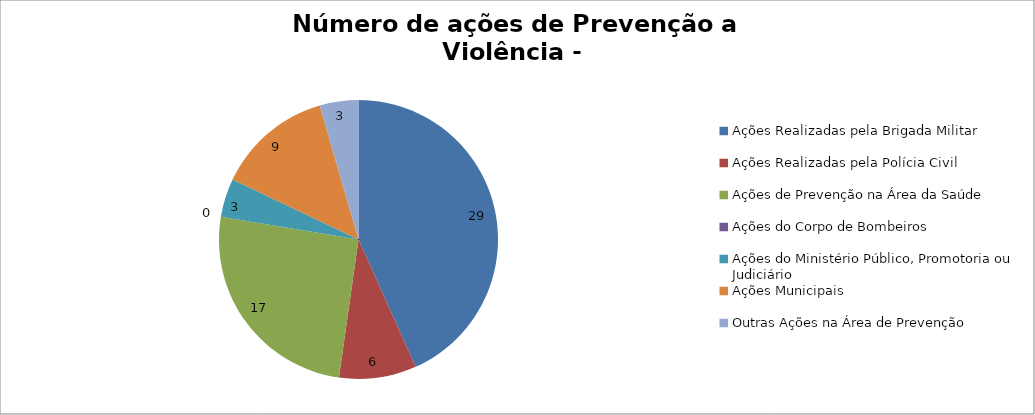
| Category | Número de Ações |
|---|---|
| Ações Realizadas pela Brigada Militar | 29 |
| Ações Realizadas pela Polícia Civil | 6 |
| Ações de Prevenção na Área da Saúde | 17 |
| Ações do Corpo de Bombeiros | 0 |
| Ações do Ministério Público, Promotoria ou Judiciário | 3 |
| Ações Municipais | 9 |
| Outras Ações na Área de Prevenção | 3 |